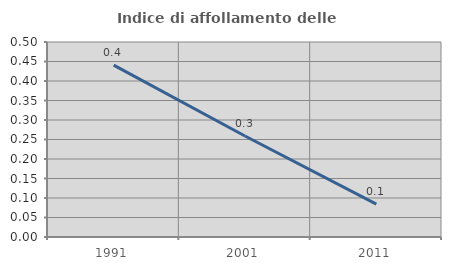
| Category | Indice di affollamento delle abitazioni  |
|---|---|
| 1991.0 | 0.441 |
| 2001.0 | 0.259 |
| 2011.0 | 0.084 |